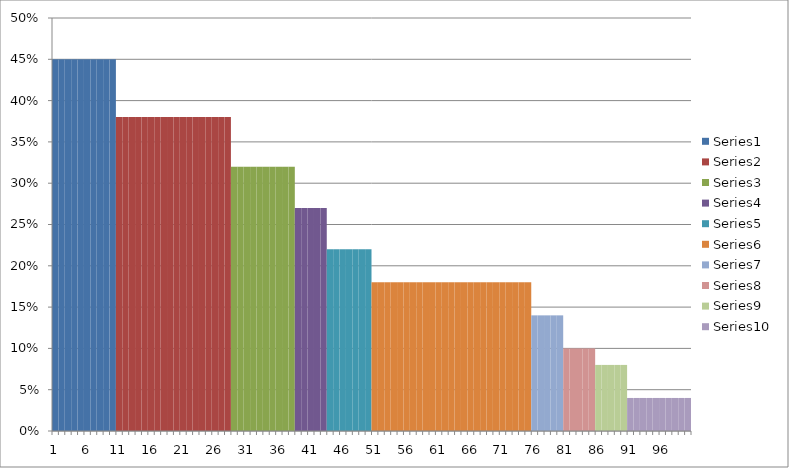
| Category | Series 0 | Series 1 | Series 2 | Series 3 | Series 4 | Series 5 | Series 6 | Series 7 | Series 8 | Series 9 |
|---|---|---|---|---|---|---|---|---|---|---|
| 0 | 0.45 | 0 | 0 | 0 | 0 | 0 | 0 | 0 | 0 | 0 |
| 1 | 0.45 | 0 | 0 | 0 | 0 | 0 | 0 | 0 | 0 | 0 |
| 2 | 0.45 | 0 | 0 | 0 | 0 | 0 | 0 | 0 | 0 | 0 |
| 3 | 0.45 | 0 | 0 | 0 | 0 | 0 | 0 | 0 | 0 | 0 |
| 4 | 0.45 | 0 | 0 | 0 | 0 | 0 | 0 | 0 | 0 | 0 |
| 5 | 0.45 | 0 | 0 | 0 | 0 | 0 | 0 | 0 | 0 | 0 |
| 6 | 0.45 | 0 | 0 | 0 | 0 | 0 | 0 | 0 | 0 | 0 |
| 7 | 0.45 | 0 | 0 | 0 | 0 | 0 | 0 | 0 | 0 | 0 |
| 8 | 0.45 | 0 | 0 | 0 | 0 | 0 | 0 | 0 | 0 | 0 |
| 9 | 0.45 | 0 | 0 | 0 | 0 | 0 | 0 | 0 | 0 | 0 |
| 10 | 0 | 0.38 | 0 | 0 | 0 | 0 | 0 | 0 | 0 | 0 |
| 11 | 0 | 0.38 | 0 | 0 | 0 | 0 | 0 | 0 | 0 | 0 |
| 12 | 0 | 0.38 | 0 | 0 | 0 | 0 | 0 | 0 | 0 | 0 |
| 13 | 0 | 0.38 | 0 | 0 | 0 | 0 | 0 | 0 | 0 | 0 |
| 14 | 0 | 0.38 | 0 | 0 | 0 | 0 | 0 | 0 | 0 | 0 |
| 15 | 0 | 0.38 | 0 | 0 | 0 | 0 | 0 | 0 | 0 | 0 |
| 16 | 0 | 0.38 | 0 | 0 | 0 | 0 | 0 | 0 | 0 | 0 |
| 17 | 0 | 0.38 | 0 | 0 | 0 | 0 | 0 | 0 | 0 | 0 |
| 18 | 0 | 0.38 | 0 | 0 | 0 | 0 | 0 | 0 | 0 | 0 |
| 19 | 0 | 0.38 | 0 | 0 | 0 | 0 | 0 | 0 | 0 | 0 |
| 20 | 0 | 0.38 | 0 | 0 | 0 | 0 | 0 | 0 | 0 | 0 |
| 21 | 0 | 0.38 | 0 | 0 | 0 | 0 | 0 | 0 | 0 | 0 |
| 22 | 0 | 0.38 | 0 | 0 | 0 | 0 | 0 | 0 | 0 | 0 |
| 23 | 0 | 0.38 | 0 | 0 | 0 | 0 | 0 | 0 | 0 | 0 |
| 24 | 0 | 0.38 | 0 | 0 | 0 | 0 | 0 | 0 | 0 | 0 |
| 25 | 0 | 0.38 | 0 | 0 | 0 | 0 | 0 | 0 | 0 | 0 |
| 26 | 0 | 0.38 | 0 | 0 | 0 | 0 | 0 | 0 | 0 | 0 |
| 27 | 0 | 0.38 | 0 | 0 | 0 | 0 | 0 | 0 | 0 | 0 |
| 28 | 0 | 0 | 0.32 | 0 | 0 | 0 | 0 | 0 | 0 | 0 |
| 29 | 0 | 0 | 0.32 | 0 | 0 | 0 | 0 | 0 | 0 | 0 |
| 30 | 0 | 0 | 0.32 | 0 | 0 | 0 | 0 | 0 | 0 | 0 |
| 31 | 0 | 0 | 0.32 | 0 | 0 | 0 | 0 | 0 | 0 | 0 |
| 32 | 0 | 0 | 0.32 | 0 | 0 | 0 | 0 | 0 | 0 | 0 |
| 33 | 0 | 0 | 0.32 | 0 | 0 | 0 | 0 | 0 | 0 | 0 |
| 34 | 0 | 0 | 0.32 | 0 | 0 | 0 | 0 | 0 | 0 | 0 |
| 35 | 0 | 0 | 0.32 | 0 | 0 | 0 | 0 | 0 | 0 | 0 |
| 36 | 0 | 0 | 0.32 | 0 | 0 | 0 | 0 | 0 | 0 | 0 |
| 37 | 0 | 0 | 0.32 | 0 | 0 | 0 | 0 | 0 | 0 | 0 |
| 38 | 0 | 0 | 0 | 0.27 | 0 | 0 | 0 | 0 | 0 | 0 |
| 39 | 0 | 0 | 0 | 0.27 | 0 | 0 | 0 | 0 | 0 | 0 |
| 40 | 0 | 0 | 0 | 0.27 | 0 | 0 | 0 | 0 | 0 | 0 |
| 41 | 0 | 0 | 0 | 0.27 | 0 | 0 | 0 | 0 | 0 | 0 |
| 42 | 0 | 0 | 0 | 0.27 | 0 | 0 | 0 | 0 | 0 | 0 |
| 43 | 0 | 0 | 0 | 0 | 0.22 | 0 | 0 | 0 | 0 | 0 |
| 44 | 0 | 0 | 0 | 0 | 0.22 | 0 | 0 | 0 | 0 | 0 |
| 45 | 0 | 0 | 0 | 0 | 0.22 | 0 | 0 | 0 | 0 | 0 |
| 46 | 0 | 0 | 0 | 0 | 0.22 | 0 | 0 | 0 | 0 | 0 |
| 47 | 0 | 0 | 0 | 0 | 0.22 | 0 | 0 | 0 | 0 | 0 |
| 48 | 0 | 0 | 0 | 0 | 0.22 | 0 | 0 | 0 | 0 | 0 |
| 49 | 0 | 0 | 0 | 0 | 0.22 | 0 | 0 | 0 | 0 | 0 |
| 50 | 0 | 0 | 0 | 0 | 0 | 0.18 | 0 | 0 | 0 | 0 |
| 51 | 0 | 0 | 0 | 0 | 0 | 0.18 | 0 | 0 | 0 | 0 |
| 52 | 0 | 0 | 0 | 0 | 0 | 0.18 | 0 | 0 | 0 | 0 |
| 53 | 0 | 0 | 0 | 0 | 0 | 0.18 | 0 | 0 | 0 | 0 |
| 54 | 0 | 0 | 0 | 0 | 0 | 0.18 | 0 | 0 | 0 | 0 |
| 55 | 0 | 0 | 0 | 0 | 0 | 0.18 | 0 | 0 | 0 | 0 |
| 56 | 0 | 0 | 0 | 0 | 0 | 0.18 | 0 | 0 | 0 | 0 |
| 57 | 0 | 0 | 0 | 0 | 0 | 0.18 | 0 | 0 | 0 | 0 |
| 58 | 0 | 0 | 0 | 0 | 0 | 0.18 | 0 | 0 | 0 | 0 |
| 59 | 0 | 0 | 0 | 0 | 0 | 0.18 | 0 | 0 | 0 | 0 |
| 60 | 0 | 0 | 0 | 0 | 0 | 0.18 | 0 | 0 | 0 | 0 |
| 61 | 0 | 0 | 0 | 0 | 0 | 0.18 | 0 | 0 | 0 | 0 |
| 62 | 0 | 0 | 0 | 0 | 0 | 0.18 | 0 | 0 | 0 | 0 |
| 63 | 0 | 0 | 0 | 0 | 0 | 0.18 | 0 | 0 | 0 | 0 |
| 64 | 0 | 0 | 0 | 0 | 0 | 0.18 | 0 | 0 | 0 | 0 |
| 65 | 0 | 0 | 0 | 0 | 0 | 0.18 | 0 | 0 | 0 | 0 |
| 66 | 0 | 0 | 0 | 0 | 0 | 0.18 | 0 | 0 | 0 | 0 |
| 67 | 0 | 0 | 0 | 0 | 0 | 0.18 | 0 | 0 | 0 | 0 |
| 68 | 0 | 0 | 0 | 0 | 0 | 0.18 | 0 | 0 | 0 | 0 |
| 69 | 0 | 0 | 0 | 0 | 0 | 0.18 | 0 | 0 | 0 | 0 |
| 70 | 0 | 0 | 0 | 0 | 0 | 0.18 | 0 | 0 | 0 | 0 |
| 71 | 0 | 0 | 0 | 0 | 0 | 0.18 | 0 | 0 | 0 | 0 |
| 72 | 0 | 0 | 0 | 0 | 0 | 0.18 | 0 | 0 | 0 | 0 |
| 73 | 0 | 0 | 0 | 0 | 0 | 0.18 | 0 | 0 | 0 | 0 |
| 74 | 0 | 0 | 0 | 0 | 0 | 0.18 | 0 | 0 | 0 | 0 |
| 75 | 0 | 0 | 0 | 0 | 0 | 0 | 0.14 | 0 | 0 | 0 |
| 76 | 0 | 0 | 0 | 0 | 0 | 0 | 0.14 | 0 | 0 | 0 |
| 77 | 0 | 0 | 0 | 0 | 0 | 0 | 0.14 | 0 | 0 | 0 |
| 78 | 0 | 0 | 0 | 0 | 0 | 0 | 0.14 | 0 | 0 | 0 |
| 79 | 0 | 0 | 0 | 0 | 0 | 0 | 0.14 | 0 | 0 | 0 |
| 80 | 0 | 0 | 0 | 0 | 0 | 0 | 0 | 0.1 | 0 | 0 |
| 81 | 0 | 0 | 0 | 0 | 0 | 0 | 0 | 0.1 | 0 | 0 |
| 82 | 0 | 0 | 0 | 0 | 0 | 0 | 0 | 0.1 | 0 | 0 |
| 83 | 0 | 0 | 0 | 0 | 0 | 0 | 0 | 0.1 | 0 | 0 |
| 84 | 0 | 0 | 0 | 0 | 0 | 0 | 0 | 0.1 | 0 | 0 |
| 85 | 0 | 0 | 0 | 0 | 0 | 0 | 0 | 0 | 0.08 | 0 |
| 86 | 0 | 0 | 0 | 0 | 0 | 0 | 0 | 0 | 0.08 | 0 |
| 87 | 0 | 0 | 0 | 0 | 0 | 0 | 0 | 0 | 0.08 | 0 |
| 88 | 0 | 0 | 0 | 0 | 0 | 0 | 0 | 0 | 0.08 | 0 |
| 89 | 0 | 0 | 0 | 0 | 0 | 0 | 0 | 0 | 0.08 | 0 |
| 90 | 0 | 0 | 0 | 0 | 0 | 0 | 0 | 0 | 0 | 0.04 |
| 91 | 0 | 0 | 0 | 0 | 0 | 0 | 0 | 0 | 0 | 0.04 |
| 92 | 0 | 0 | 0 | 0 | 0 | 0 | 0 | 0 | 0 | 0.04 |
| 93 | 0 | 0 | 0 | 0 | 0 | 0 | 0 | 0 | 0 | 0.04 |
| 94 | 0 | 0 | 0 | 0 | 0 | 0 | 0 | 0 | 0 | 0.04 |
| 95 | 0 | 0 | 0 | 0 | 0 | 0 | 0 | 0 | 0 | 0.04 |
| 96 | 0 | 0 | 0 | 0 | 0 | 0 | 0 | 0 | 0 | 0.04 |
| 97 | 0 | 0 | 0 | 0 | 0 | 0 | 0 | 0 | 0 | 0.04 |
| 98 | 0 | 0 | 0 | 0 | 0 | 0 | 0 | 0 | 0 | 0.04 |
| 99 | 0 | 0 | 0 | 0 | 0 | 0 | 0 | 0 | 0 | 0.04 |